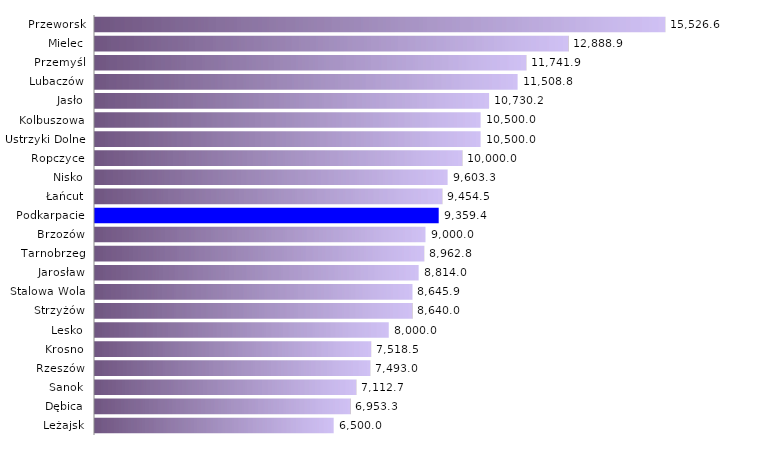
| Category | Bon na zasiedlenie |
|---|---|
| Leżajsk | 6500 |
| Dębica | 6953.257 |
| Sanok | 7112.727 |
| Rzeszów | 7492.958 |
| Krosno | 7518.519 |
| Lesko | 8000 |
| Strzyżów | 8640 |
| Stalowa Wola | 8645.907 |
| Jarosław | 8814.035 |
| Tarnobrzeg | 8962.751 |
| Brzozów | 9000 |
| Podkarpacie | 9359.372 |
| Łańcut | 9454.545 |
| Nisko | 9603.298 |
| Ropczyce | 10000 |
| Ustrzyki Dolne | 10500 |
| Kolbuszowa | 10500 |
| Jasło | 10730.158 |
| Lubaczów | 11508.824 |
| Przemyśl | 11741.893 |
| Mielec | 12888.889 |
| Przeworsk | 15526.57 |